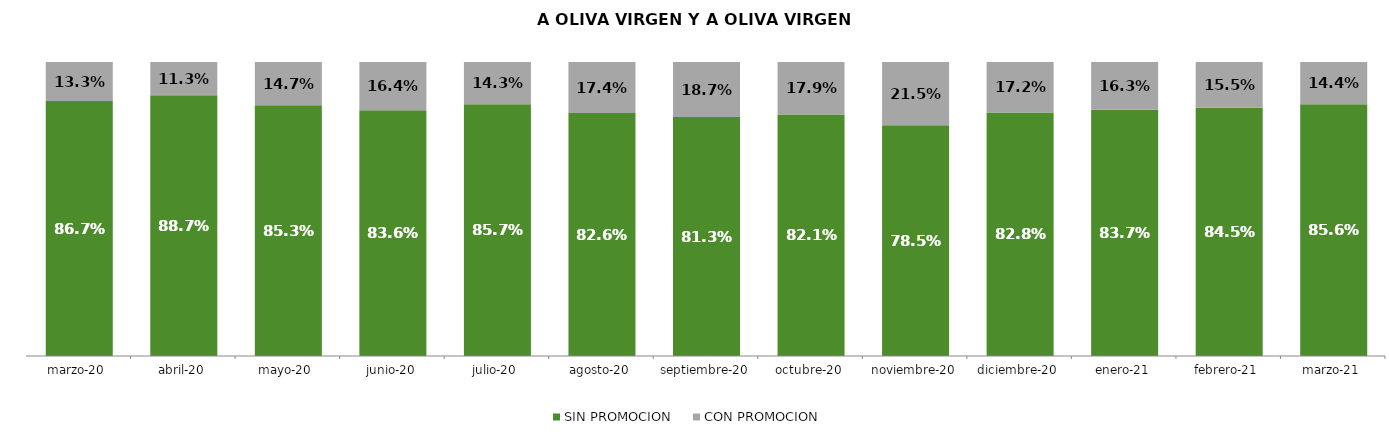
| Category | SIN PROMOCION   | CON PROMOCION   |
|---|---|---|
| 2020-03-01 | 0.867 | 0.133 |
| 2020-04-01 | 0.887 | 0.113 |
| 2020-05-01 | 0.853 | 0.147 |
| 2020-06-01 | 0.836 | 0.164 |
| 2020-07-01 | 0.857 | 0.143 |
| 2020-08-01 | 0.826 | 0.174 |
| 2020-09-01 | 0.813 | 0.187 |
| 2020-10-01 | 0.821 | 0.179 |
| 2020-11-01 | 0.785 | 0.215 |
| 2020-12-01 | 0.828 | 0.172 |
| 2021-01-01 | 0.837 | 0.163 |
| 2021-02-01 | 0.845 | 0.155 |
| 2021-03-01 | 0.856 | 0.144 |